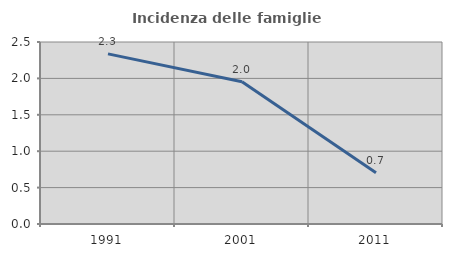
| Category | Incidenza delle famiglie numerose |
|---|---|
| 1991.0 | 2.337 |
| 2001.0 | 1.953 |
| 2011.0 | 0.703 |